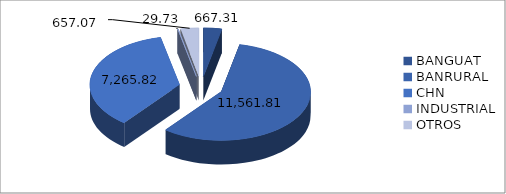
| Category | Series 0 |
|---|---|
| BANGUAT | 667.307 |
| BANRURAL | 11561.809 |
| CHN | 7265.82 |
| INDUSTRIAL | 29.728 |
| OTROS | 657.074 |